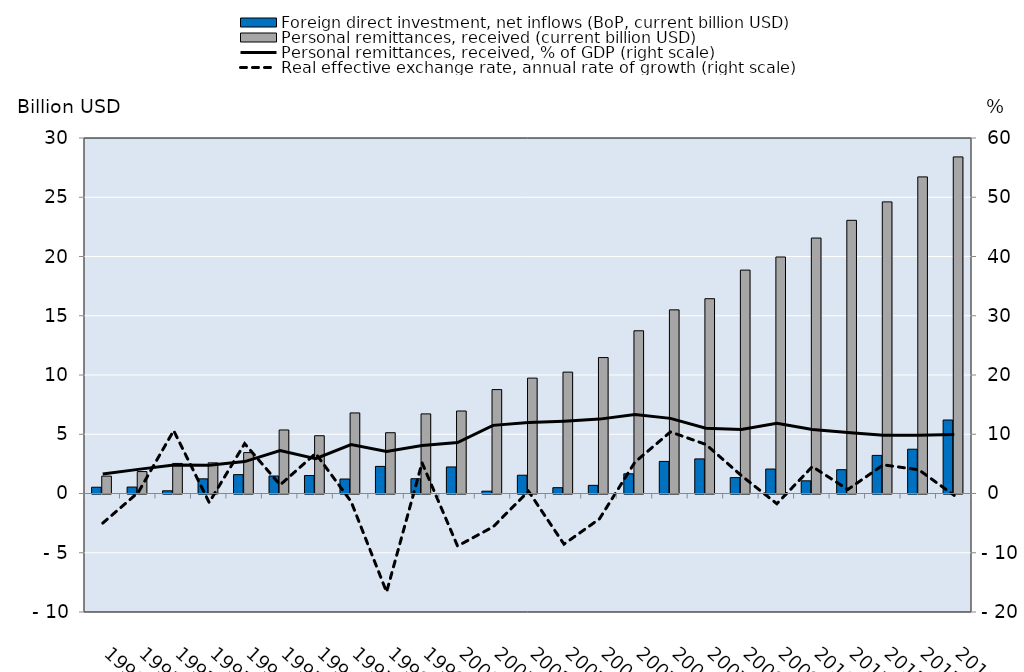
| Category | Foreign direct investment, net inflows (BoP, current billion USD) | Personal remittances, received (current billion USD) |
|---|---|---|
| 1990 | 0.53 | 1.465 |
| 1991 | 0.544 | 1.85 |
| 1992 | 0.228 | 2.538 |
| 1993 | 1.238 | 2.587 |
| 1994 | 1.591 | 3.452 |
| 1995 | 1.478 | 5.36 |
| 1996 | 1.517 | 4.875 |
| 1997 | 1.222 | 6.799 |
| 1998 | 2.287 | 5.13 |
| 1999 | 1.247 | 6.717 |
| 2000 | 2.24 | 6.961 |
| 2001 | 0.195 | 8.769 |
| 2002 | 1.542 | 9.735 |
| 2003 | 0.491 | 10.243 |
| 2004 | 0.688 | 11.471 |
| 2005 | 1.664 | 13.733 |
| 2006 | 2.707 | 15.496 |
| 2007 | 2.919 | 16.437 |
| 2008 | 1.34 | 18.851 |
| 2009 | 2.065 | 19.96 |
| 2010 | 1.07 | 21.557 |
| 2011 | 2.007 | 23.054 |
| 2012 | 3.215 | 24.61 |
| 2013 | 3.737 | 26.717 |
| 2014 | 6.202 | 28.403 |